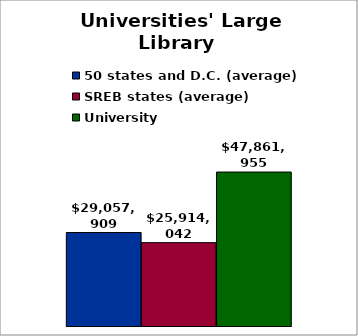
| Category | 50 states and D.C. (average) | SREB states (average) | University |
|---|---|---|---|
| 0 | 29057908.828 | 25914041.6 | 47861955 |